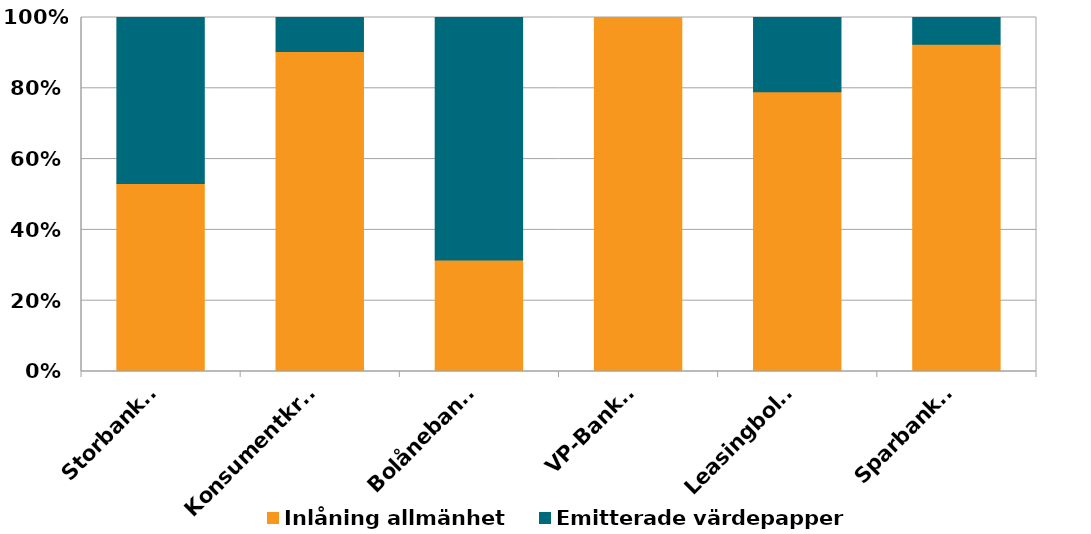
| Category | Inlåning allmänhet | Emitterade värdepapper |
|---|---|---|
| Storbanker | 0.531 | 0.469 |
| Konsumentkredit | 0.904 | 0.096 |
| Bolånebanker | 0.315 | 0.685 |
| VP-Banker | 1 | 0 |
| Leasingbolag | 0.79 | 0.21 |
| Sparbanker | 0.925 | 0.075 |